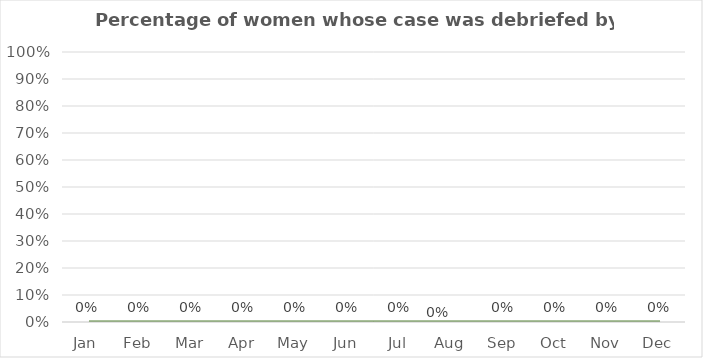
| Category | Percentage of women whose case was debriefed |
|---|---|
| Jan | 0 |
| Feb | 0 |
| Mar | 0 |
| Apr | 0 |
| May | 0 |
| Jun | 0 |
| Jul | 0 |
| Aug | 0 |
| Sep | 0 |
| Oct | 0 |
| Nov | 0 |
| Dec | 0 |